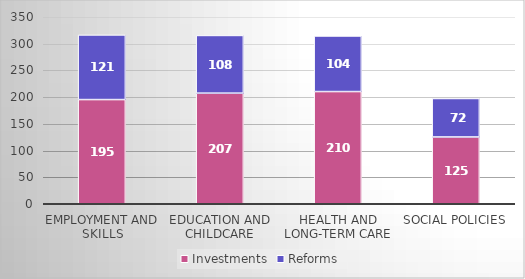
| Category | Investments | Reforms |
|---|---|---|
| Employment And Skills | 195 | 121 |
| Education And Childcare | 207 | 108 |
| Health And Long-Term Care | 210 | 104 |
| Social Policies | 125 | 72 |